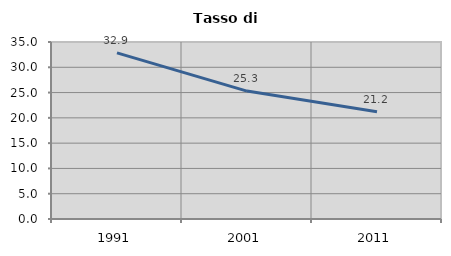
| Category | Tasso di disoccupazione   |
|---|---|
| 1991.0 | 32.852 |
| 2001.0 | 25.294 |
| 2011.0 | 21.213 |